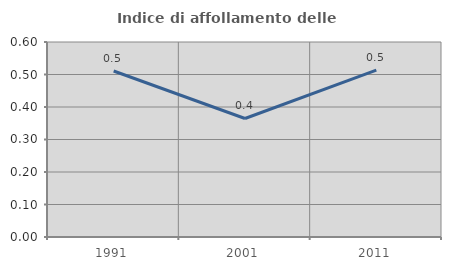
| Category | Indice di affollamento delle abitazioni  |
|---|---|
| 1991.0 | 0.511 |
| 2001.0 | 0.365 |
| 2011.0 | 0.513 |